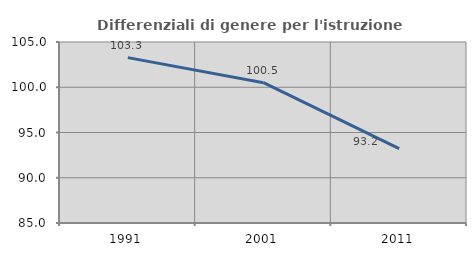
| Category | Differenziali di genere per l'istruzione superiore |
|---|---|
| 1991.0 | 103.274 |
| 2001.0 | 100.508 |
| 2011.0 | 93.211 |